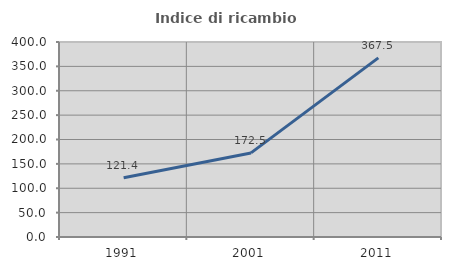
| Category | Indice di ricambio occupazionale  |
|---|---|
| 1991.0 | 121.364 |
| 2001.0 | 172.485 |
| 2011.0 | 367.517 |